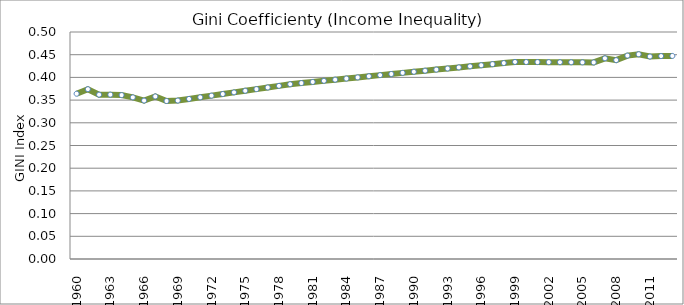
| Category | Series 0 |
|---|---|
| 1960.0 | 0.364 |
| 1961.0 | 0.374 |
| 1962.0 | 0.362 |
| 1963.0 | 0.362 |
| 1964.0 | 0.361 |
| 1965.0 | 0.356 |
| 1966.0 | 0.349 |
| 1967.0 | 0.358 |
| 1968.0 | 0.348 |
| 1969.0 | 0.349 |
| 1970.0 | 0.353 |
| 1971.0 | 0.356 |
| 1972.0 | 0.36 |
| 1973.0 | 0.363 |
| 1974.0 | 0.367 |
| 1975.0 | 0.371 |
| 1976.0 | 0.374 |
| 1977.0 | 0.378 |
| 1978.0 | 0.381 |
| 1979.0 | 0.385 |
| 1980.0 | 0.388 |
| 1981.0 | 0.39 |
| 1982.0 | 0.392 |
| 1983.0 | 0.395 |
| 1984.0 | 0.397 |
| 1985.0 | 0.4 |
| 1986.0 | 0.402 |
| 1987.0 | 0.405 |
| 1988.0 | 0.408 |
| 1989.0 | 0.41 |
| 1990.0 | 0.412 |
| 1991.0 | 0.415 |
| 1992.0 | 0.417 |
| 1993.0 | 0.42 |
| 1994.0 | 0.422 |
| 1995.0 | 0.424 |
| 1996.0 | 0.427 |
| 1997.0 | 0.429 |
| 1998.0 | 0.432 |
| 1999.0 | 0.434 |
| 2000.0 | 0.434 |
| 2001.0 | 0.434 |
| 2002.0 | 0.434 |
| 2003.0 | 0.433 |
| 2004.0 | 0.433 |
| 2005.0 | 0.433 |
| 2006.0 | 0.433 |
| 2007.0 | 0.442 |
| 2008.0 | 0.438 |
| 2009.0 | 0.448 |
| 2010.0 | 0.451 |
| 2011.0 | 0.446 |
| 2012.0 | 0.447 |
| 2013.0 | 0.447 |